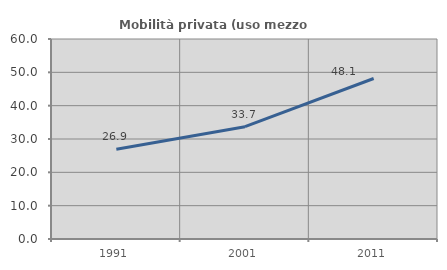
| Category | Mobilità privata (uso mezzo privato) |
|---|---|
| 1991.0 | 26.936 |
| 2001.0 | 33.694 |
| 2011.0 | 48.148 |